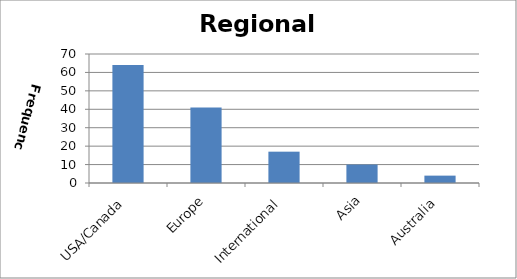
| Category | Regional Affiliations |
|---|---|
| USA/Canada | 64 |
| Europe | 41 |
| International | 17 |
| Asia | 10 |
| Australia | 4 |